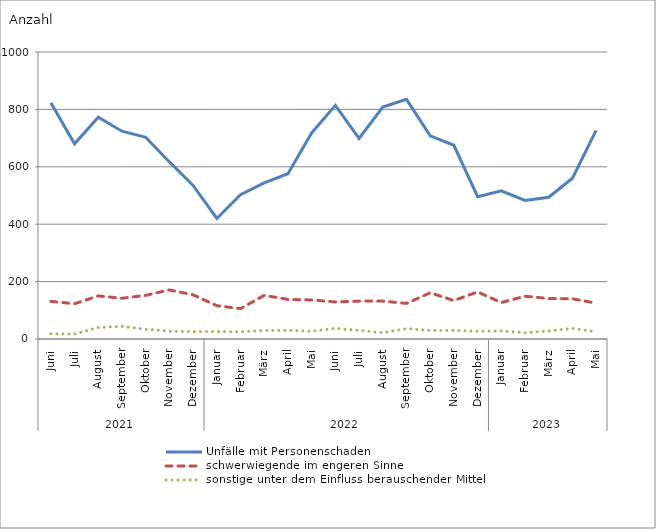
| Category | Unfälle mit Personenschaden | schwerwiegende im engeren Sinne | sonstige unter dem Einfluss berauschender Mittel |
|---|---|---|---|
| 0 | 823 | 131 | 18 |
| 1 | 680 | 123 | 17 |
| 2 | 773 | 150 | 40 |
| 3 | 724 | 142 | 44 |
| 4 | 703 | 152 | 34 |
| 5 | 617 | 171 | 27 |
| 6 | 535 | 154 | 26 |
| 7 | 420 | 116 | 26 |
| 8 | 503 | 106 | 25 |
| 9 | 544 | 152 | 30 |
| 10 | 576 | 138 | 30 |
| 11 | 718 | 136 | 27 |
| 12 | 814 | 129 | 37 |
| 13 | 699 | 132 | 30 |
| 14 | 808 | 132 | 22 |
| 15 | 835 | 124 | 36 |
| 16 | 708 | 161 | 30 |
| 17 | 675 | 134 | 30 |
| 18 | 496 | 164 | 27 |
| 19 | 516 | 127 | 28 |
| 20 | 483 | 149 | 22 |
| 21 | 494 | 141 | 28 |
| 22 | 560 | 140 | 37 |
| 23 | 727 | 125 | 25 |